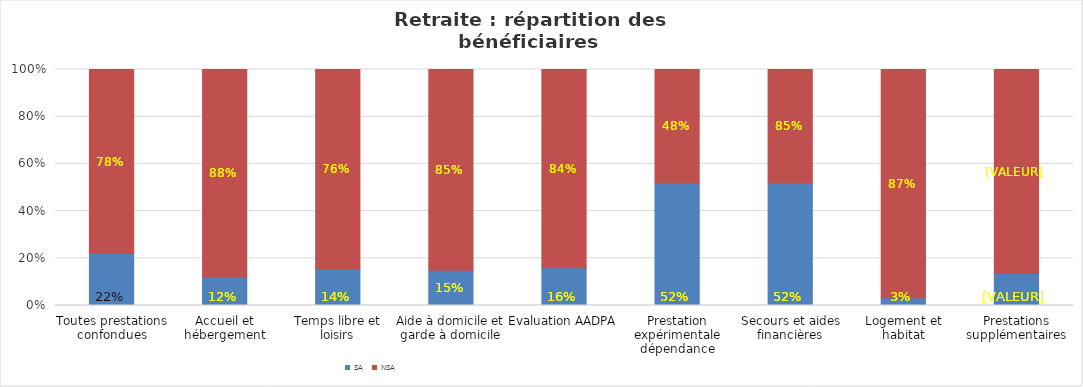
| Category | SA | NSA |
|---|---|---|
| Toutes prestations confondues | 0.22 | 0.78 |
| Accueil et hébergement | 0.121 | 0.88 |
| Temps libre et loisirs | 0.14 | 0.76 |
| Aide à domicile et garde à domicile | 0.15 | 0.85 |
| Evaluation AADPA | 0.16 | 0.84 |
| Prestation expérimentale dépendance | 0.52 | 0.48 |
| Secours et aides financières | 0.52 | 0.48 |
| Logement et habitat | 0.03 | 0.87 |
| Prestations supplémentaires | 0.135 | 0.865 |